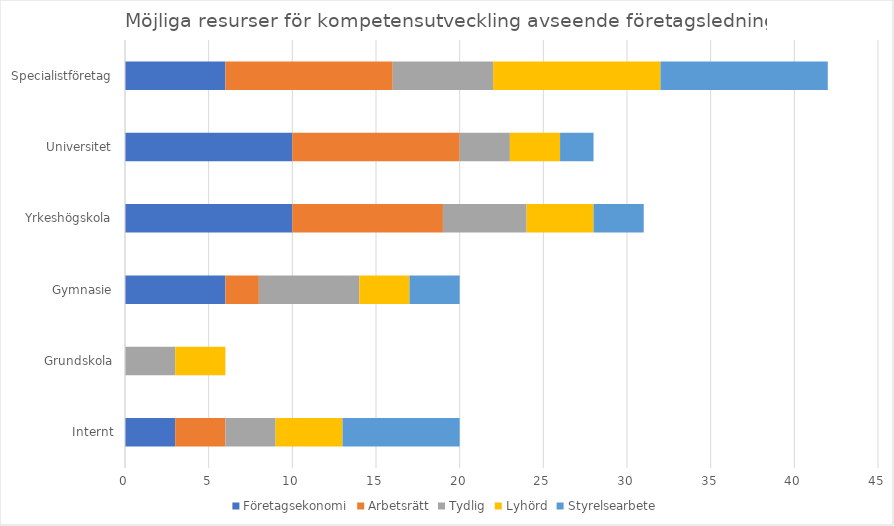
| Category | Företagsekonomi | Arbetsrätt | Tydlig | Lyhörd | Styrelsearbete |
|---|---|---|---|---|---|
| Internt | 3 | 3 | 3 | 4 | 7 |
| Grundskola | 0 | 0 | 3 | 3 | 0 |
| Gymnasie | 6 | 2 | 6 | 3 | 3 |
| Yrkeshögskola | 10 | 9 | 5 | 4 | 3 |
| Universitet | 10 | 10 | 3 | 3 | 2 |
| Specialistföretag | 6 | 10 | 6 | 10 | 10 |